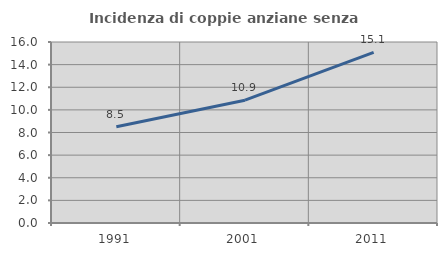
| Category | Incidenza di coppie anziane senza figli  |
|---|---|
| 1991.0 | 8.503 |
| 2001.0 | 10.857 |
| 2011.0 | 15.084 |